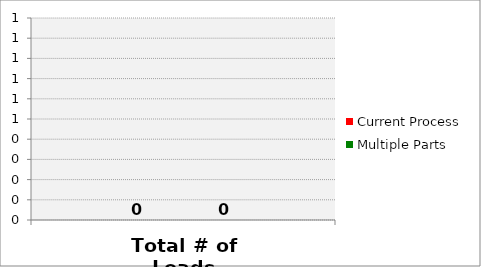
| Category | Current Process | Multiple Parts |
|---|---|---|
| Total # of Loads | 0 | 0 |